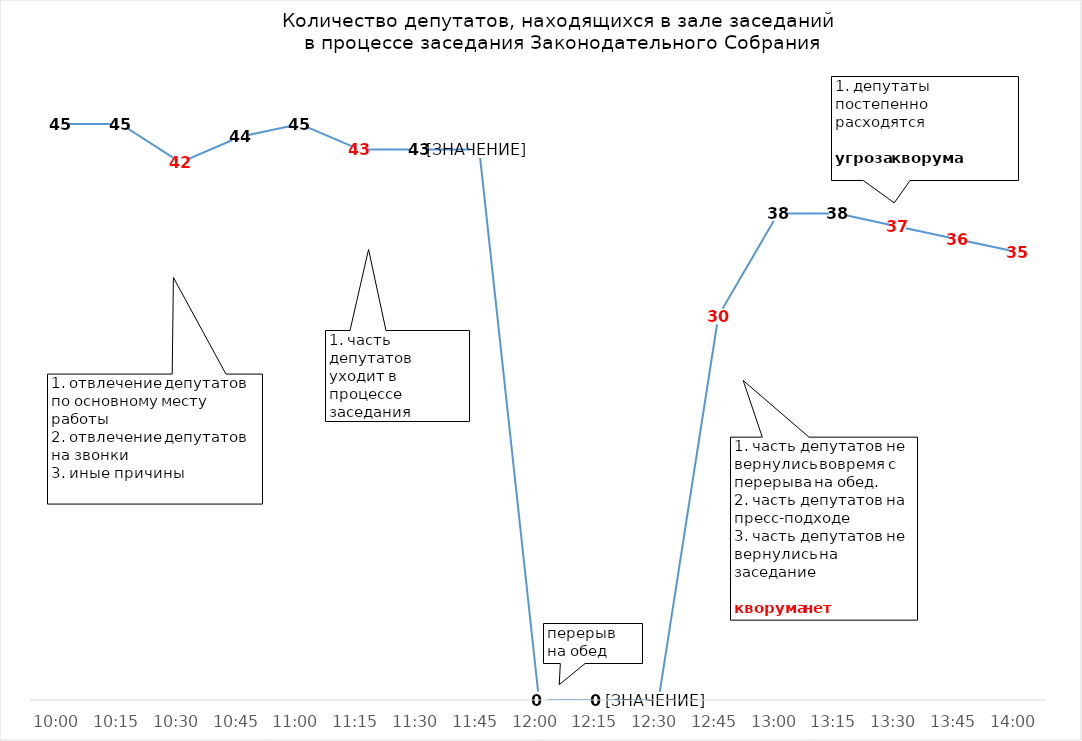
| Category | Количество депутатов |
|---|---|
| 0.4166666666666667 | 45 |
| 0.4270833333333333 | 45 |
| 0.4375 | 42 |
| 0.447916666666667 | 44 |
| 0.458333333333333 | 45 |
| 0.46875 | 43 |
| 0.479166666666666 | 43 |
| 0.489583333333333 | 43 |
| 0.5 | 0 |
| 0.510416666666666 | 0 |
| 0.520833333333333 | 0 |
| 0.53125 | 30 |
| 0.541666666666667 | 38 |
| 0.552083333333333 | 38 |
| 0.5625 | 37 |
| 0.572916666666666 | 36 |
| 0.583333333333333 | 35 |